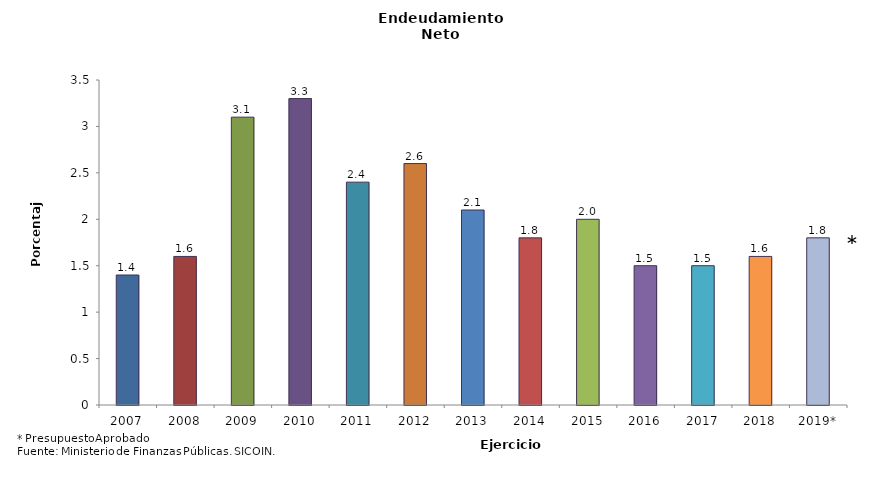
| Category | Series 0 |
|---|---|
| 2007 | 1.4 |
| 2008 | 1.6 |
| 2009 | 3.1 |
| 2010 | 3.3 |
| 2011 | 2.4 |
| 2012 | 2.6 |
| 2013 | 2.1 |
| 2014 | 1.8 |
| 2015 | 2 |
| 2016 | 1.5 |
| 2017 | 1.5 |
| 2018 | 1.6 |
| 2019* | 1.8 |